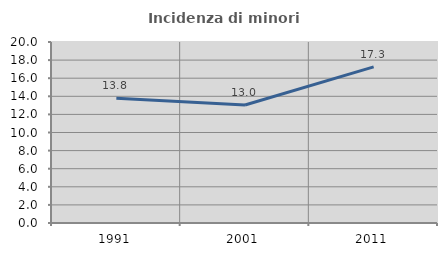
| Category | Incidenza di minori stranieri |
|---|---|
| 1991.0 | 13.793 |
| 2001.0 | 13.043 |
| 2011.0 | 17.254 |